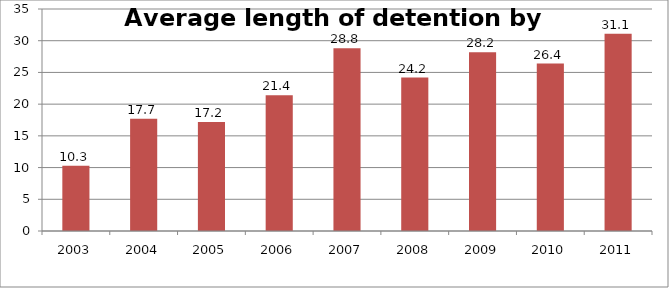
| Category | Series 1 |
|---|---|
| 2003.0 | 10.3 |
| 2004.0 | 17.7 |
| 2005.0 | 17.2 |
| 2006.0 | 21.4 |
| 2007.0 | 28.8 |
| 2008.0 | 24.2 |
| 2009.0 | 28.2 |
| 2010.0 | 26.4 |
| 2011.0 | 31.1 |